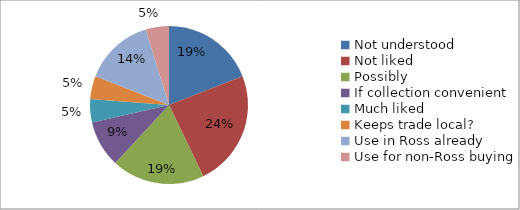
| Category | Series 0 |
|---|---|
| Not understood | 4 |
| Not liked | 5 |
| Possibly | 4 |
| If collection convenient | 2 |
| Much liked | 1 |
| Keeps trade local? | 1 |
| Use in Ross already | 3 |
| Use for non-Ross buying | 1 |